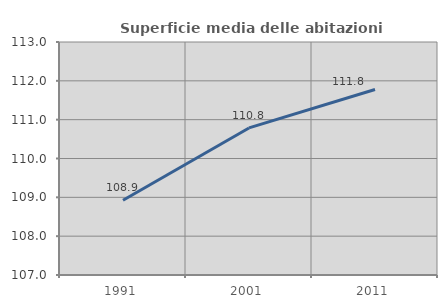
| Category | Superficie media delle abitazioni occupate |
|---|---|
| 1991.0 | 108.923 |
| 2001.0 | 110.787 |
| 2011.0 | 111.778 |